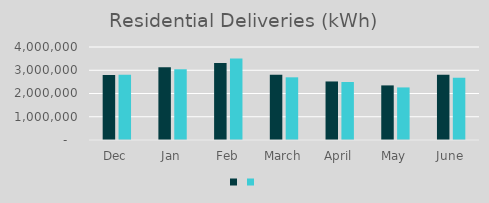
| Category | Series 1 | Series 0 |
|---|---|---|
| Dec | 2793607 | 2803771 |
| Jan | 3124442 | 3040217 |
| Feb | 3307618 | 3510451 |
| March | 2805250 | 2696163 |
| April | 2517652 | 2493703 |
| May | 2348338 | 2261286 |
| June | 2806791 | 2677737 |